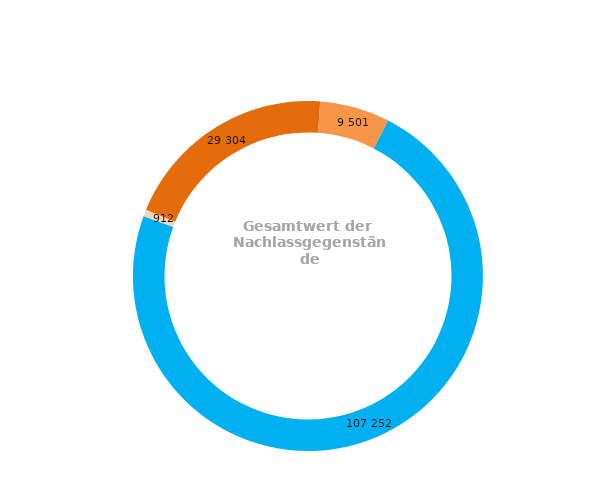
| Category | Series 0 |
|---|---|
| 0 | 912 |
| 1 | 29304 |
| 2 | 9501 |
| 3 | 107252 |